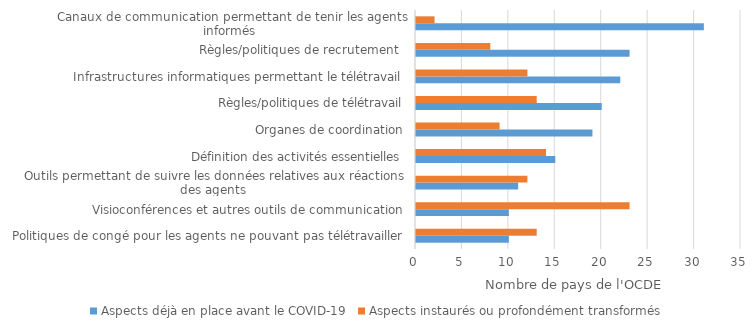
| Category | Aspects déjà en place avant le COVID-19 | Aspects instaurés ou profondément transformés |
|---|---|---|
| Politiques de congé pour les agents ne pouvant pas télétravailler | 10 | 13 |
| Visioconférences et autres outils de communication | 10 | 23 |
| Outils permettant de suivre les données relatives aux réactions des agents  | 11 | 12 |
| Définition des activités essentielles | 15 | 14 |
| Organes de coordination | 19 | 9 |
| Règles/politiques de télétravail | 20 | 13 |
| Infrastructures informatiques permettant le télétravail  | 22 | 12 |
| Règles/politiques de recrutement  | 23 | 8 |
| Canaux de communication permettant de tenir les agents informés  | 31 | 2 |